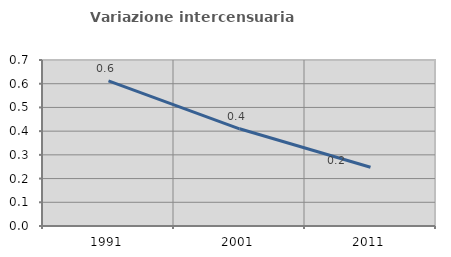
| Category | Variazione intercensuaria annua |
|---|---|
| 1991.0 | 0.612 |
| 2001.0 | 0.41 |
| 2011.0 | 0.248 |